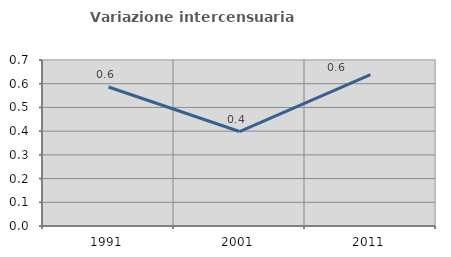
| Category | Variazione intercensuaria annua |
|---|---|
| 1991.0 | 0.586 |
| 2001.0 | 0.398 |
| 2011.0 | 0.639 |